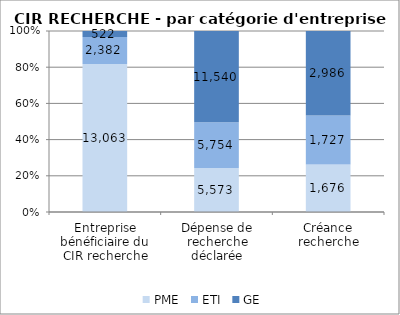
| Category | PME | ETI | GE |
|---|---|---|---|
| Entreprise bénéficiaire du CIR recherche | 13063 | 2382 | 522 |
| Dépense de recherche déclarée | 5573.38 | 5753.82 | 11539.68 |
| Créance recherche | 1675.86 | 1727 | 2985.52 |